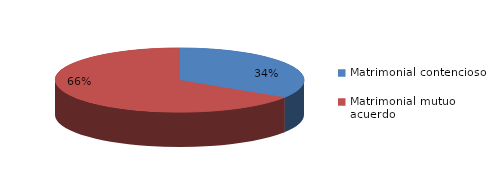
| Category | Series 0 |
|---|---|
| 0 | 48 |
| 1 | 93 |